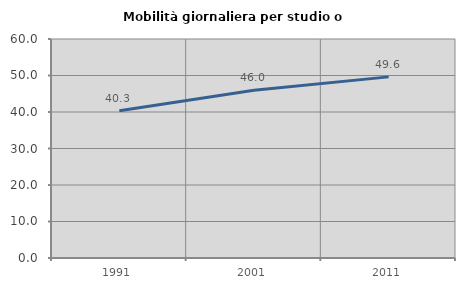
| Category | Mobilità giornaliera per studio o lavoro |
|---|---|
| 1991.0 | 40.317 |
| 2001.0 | 45.983 |
| 2011.0 | 49.622 |